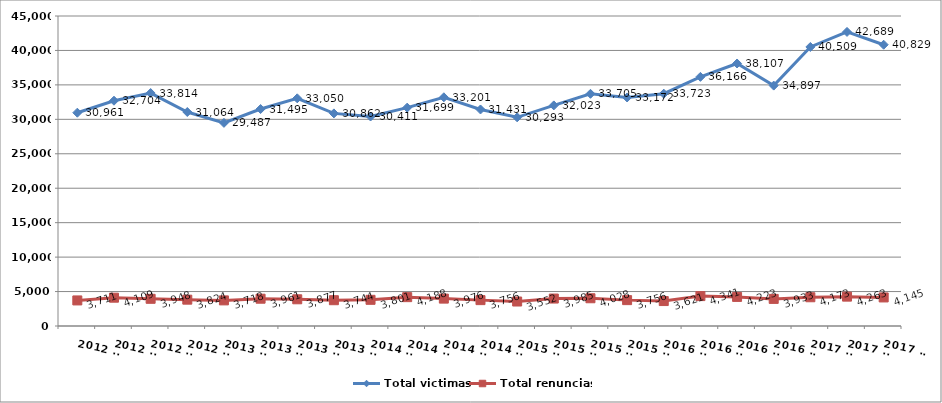
| Category | Total victimas | Total renuncias |
|---|---|---|
| 2012 T1 | 30961 | 3711 |
| 2012 T2 | 32704 | 4109 |
| 2012 T3 | 33814 | 3948 |
| 2012 T4 | 31064 | 3824 |
| 2013 T1 | 29487 | 3718 |
| 2013 T2 | 31495 | 3961 |
| 2013 T3 | 33050 | 3877 |
| 2013 T4 | 30862 | 3744 |
| 2014 T1 | 30411 | 3801 |
| 2014 T2 | 31699 | 4188 |
| 2014 T3 | 33201 | 3976 |
| 2014 T4 | 31431 | 3756 |
| 2015 T1 | 30293 | 3552 |
| 2015 T2 | 32023 | 3985 |
| 2015 T3 | 33705 | 4028 |
| 2015 T4 | 33172 | 3756 |
| 2016 T1 | 33723 | 3621 |
| 2016 T2 | 36166 | 4341 |
| 2016 T3 | 38107 | 4223 |
| 2016 T4 | 34897 | 3933 |
| 2017 T1 | 40509 | 4173 |
| 2017 T2 | 42689 | 4263 |
| 2017 T3 | 40829 | 4145 |